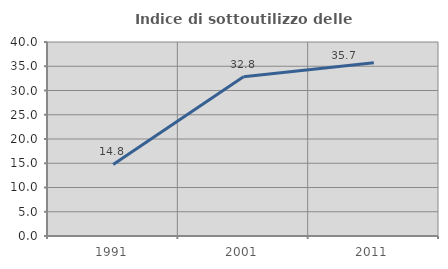
| Category | Indice di sottoutilizzo delle abitazioni  |
|---|---|
| 1991.0 | 14.765 |
| 2001.0 | 32.836 |
| 2011.0 | 35.714 |